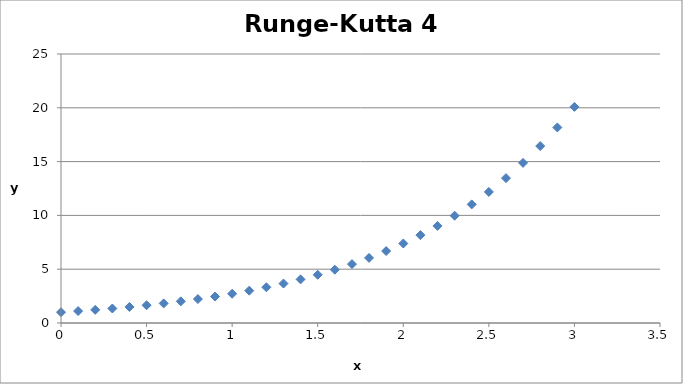
| Category | Series 0 |
|---|---|
| 0.0 | 1 |
| 0.1 | 1.105 |
| 0.2 | 1.221 |
| 0.3 | 1.35 |
| 0.4 | 1.492 |
| 0.5 | 1.649 |
| 0.6 | 1.822 |
| 0.7 | 2.014 |
| 0.8 | 2.226 |
| 0.9 | 2.46 |
| 1.0 | 2.718 |
| 1.1 | 3.004 |
| 1.2 | 3.32 |
| 1.3 | 3.669 |
| 1.4 | 4.055 |
| 1.5 | 4.482 |
| 1.6 | 4.953 |
| 1.7 | 5.474 |
| 1.8 | 6.05 |
| 1.9 | 6.686 |
| 2.0 | 7.389 |
| 2.1 | 8.166 |
| 2.2 | 9.025 |
| 2.3 | 9.974 |
| 2.4 | 11.023 |
| 2.5 | 12.182 |
| 2.6 | 13.464 |
| 2.7 | 14.88 |
| 2.8 | 16.445 |
| 2.9 | 18.174 |
| 3.0 | 20.085 |